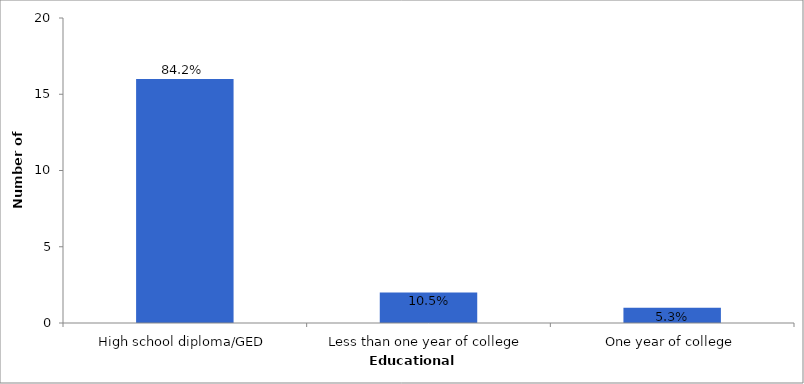
| Category | Series 0 |
|---|---|
| High school diploma/GED | 16 |
| Less than one year of college | 2 |
| One year of college | 1 |